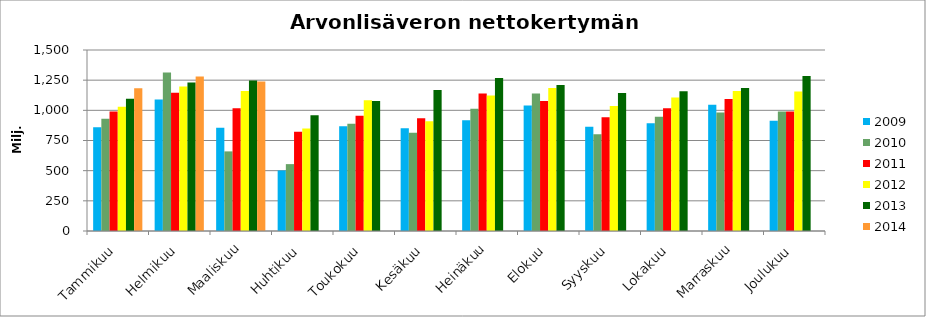
| Category | 2009 | 2010 | 2011 | 2012 | 2013 | 2014 |
|---|---|---|---|---|---|---|
| Tammikuu | 858.934 | 929.369 | 989.979 | 1030.641 | 1096.075 | 1182.963 |
| Helmikuu | 1089.664 | 1313.151 | 1145.438 | 1198.153 | 1230.33 | 1280.053 |
| Maaliskuu | 856.122 | 659.776 | 1016.463 | 1160.067 | 1247.422 | 1238.066 |
| Huhtikuu | 501.743 | 554.255 | 821.506 | 848.926 | 959.001 | 0 |
| Toukokuu | 867.163 | 889.769 | 955.963 | 1083.741 | 1078.37 | 0 |
| Kesäkuu | 851.056 | 814.024 | 933.418 | 909.246 | 1168.206 | 0 |
| Heinäkuu | 918.059 | 1013.537 | 1139.789 | 1122.196 | 1267.424 | 0 |
| Elokuu | 1040.537 | 1139.703 | 1077.137 | 1184.622 | 1210.636 | 0 |
| Syyskuu | 863.546 | 801.068 | 941.737 | 1035.954 | 1142.819 | 0 |
| Lokakuu | 892.063 | 947.674 | 1018.067 | 1107.374 | 1157.981 | 0 |
| Marraskuu | 1046.386 | 981.431 | 1094.661 | 1159.214 | 1185.544 | 0 |
| Joulukuu | 914.348 | 991.049 | 989.325 | 1156.453 | 1284.095 | 0 |